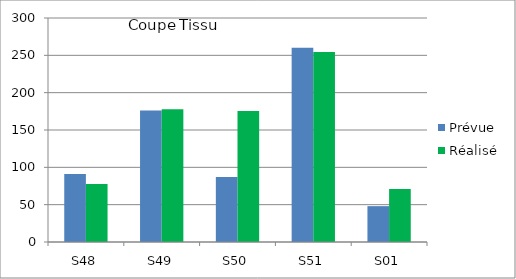
| Category | Prévue | Réalisé |
|---|---|---|
| S48 | 91 | 77.588 |
| S49 | 176 | 177.707 |
| S50 | 87 | 175.607 |
| S51 | 260 | 254.404 |
| S01 | 48 | 71 |